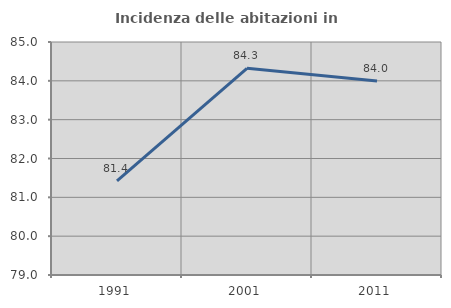
| Category | Incidenza delle abitazioni in proprietà  |
|---|---|
| 1991.0 | 81.423 |
| 2001.0 | 84.323 |
| 2011.0 | 83.994 |